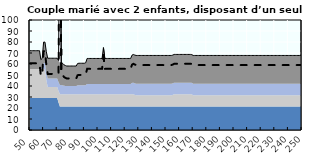
| Category | Coin fiscal marginal (somme des composantes) | Taux d’imposition marginal net |
|---|---|---|
| 50.0 | 72.098 | 60.645 |
| 51.0 | 72.098 | 60.645 |
| 52.0 | 72.098 | 60.645 |
| 53.0 | 72.098 | 60.645 |
| 54.0 | 72.098 | 60.645 |
| 55.0 | 72.098 | 60.645 |
| 56.0 | 72.098 | 60.645 |
| 57.0 | 72.098 | 60.645 |
| 58.0 | 63.937 | 49.135 |
| 59.0 | 65.15 | 50.845 |
| 60.0 | 79.927 | 71.687 |
| 61.0 | 79.927 | 71.687 |
| 62.0 | 71.124 | 59.271 |
| 63.0 | 65.244 | 50.978 |
| 64.0 | 65.244 | 50.978 |
| 65.0 | 65.244 | 50.978 |
| 66.0 | 65.244 | 50.978 |
| 67.0 | 65.244 | 50.978 |
| 68.0 | 65.244 | 50.978 |
| 69.0 | 65.244 | 50.978 |
| 70.0 | 65.244 | 50.978 |
| 71.0 | 63.136 | 50.978 |
| 72.0 | 229.432 | 264.441 |
| 73.0 | 61.414 | 50.978 |
| 74.0 | 60.575 | 49.912 |
| 75.0 | 59.243 | 48.22 |
| 76.0 | 58.619 | 47.426 |
| 77.0 | 58.158 | 46.84 |
| 78.0 | 58.158 | 46.84 |
| 79.0 | 58.158 | 46.84 |
| 80.0 | 58.158 | 46.84 |
| 81.0 | 58.158 | 46.84 |
| 82.0 | 58.158 | 46.84 |
| 83.0 | 58.158 | 46.84 |
| 84.0 | 58.158 | 46.84 |
| 85.0 | 60.482 | 49.794 |
| 86.0 | 60.691 | 50.059 |
| 87.0 | 60.691 | 50.059 |
| 88.0 | 60.691 | 50.059 |
| 89.0 | 60.691 | 50.059 |
| 90.0 | 60.691 | 50.059 |
| 91.0 | 61.2 | 50.706 |
| 92.0 | 65.033 | 55.575 |
| 93.0 | 65.033 | 55.575 |
| 94.0 | 65.033 | 55.575 |
| 95.0 | 65.033 | 55.575 |
| 96.0 | 65.033 | 55.575 |
| 97.0 | 65.033 | 55.575 |
| 98.0 | 65.033 | 55.575 |
| 99.0 | 65.033 | 55.575 |
| 100.0 | 65.033 | 55.575 |
| 101.0 | 65.033 | 55.575 |
| 102.0 | 65.033 | 55.575 |
| 103.0 | 65.033 | 55.575 |
| 104.0 | 74.905 | 68.118 |
| 105.0 | 65.033 | 55.575 |
| 106.0 | 65.033 | 55.575 |
| 107.0 | 65.033 | 55.575 |
| 108.0 | 65.033 | 55.575 |
| 109.0 | 65.033 | 55.575 |
| 110.0 | 65.033 | 55.575 |
| 111.0 | 65.033 | 55.575 |
| 112.0 | 65.033 | 55.575 |
| 113.0 | 65.033 | 55.575 |
| 114.0 | 65.033 | 55.575 |
| 115.0 | 65.033 | 55.575 |
| 116.0 | 65.033 | 55.575 |
| 117.0 | 65.033 | 55.575 |
| 118.0 | 65.033 | 55.575 |
| 119.0 | 65.033 | 55.575 |
| 120.0 | 65.033 | 55.575 |
| 121.0 | 65.033 | 55.575 |
| 122.0 | 65.033 | 55.575 |
| 123.0 | 65.033 | 55.575 |
| 124.0 | 65.033 | 55.575 |
| 125.0 | 68.026 | 59.378 |
| 126.0 | 68.651 | 60.172 |
| 127.0 | 68.159 | 59.547 |
| 128.0 | 67.762 | 59.042 |
| 129.0 | 67.762 | 59.042 |
| 130.0 | 67.762 | 59.042 |
| 131.0 | 67.762 | 59.042 |
| 132.0 | 67.762 | 59.042 |
| 133.0 | 67.762 | 59.042 |
| 134.0 | 67.762 | 59.042 |
| 135.0 | 67.762 | 59.042 |
| 136.0 | 67.762 | 59.042 |
| 137.0 | 67.762 | 59.042 |
| 138.0 | 67.762 | 59.042 |
| 139.0 | 67.762 | 59.042 |
| 140.0 | 67.762 | 59.042 |
| 141.0 | 67.762 | 59.042 |
| 142.0 | 67.762 | 59.042 |
| 143.0 | 67.762 | 59.042 |
| 144.0 | 67.762 | 59.042 |
| 145.0 | 67.762 | 59.042 |
| 146.0 | 67.762 | 59.042 |
| 147.0 | 67.762 | 59.042 |
| 148.0 | 67.762 | 59.042 |
| 149.0 | 67.762 | 59.042 |
| 150.0 | 67.762 | 59.042 |
| 151.0 | 67.762 | 59.042 |
| 152.0 | 67.762 | 59.042 |
| 153.0 | 67.762 | 59.042 |
| 154.0 | 67.762 | 59.042 |
| 155.0 | 68.104 | 59.477 |
| 156.0 | 68.695 | 60.227 |
| 157.0 | 68.695 | 60.227 |
| 158.0 | 68.695 | 60.227 |
| 159.0 | 68.695 | 60.227 |
| 160.0 | 68.695 | 60.227 |
| 161.0 | 68.695 | 60.227 |
| 162.0 | 68.695 | 60.227 |
| 163.0 | 68.695 | 60.227 |
| 164.0 | 68.695 | 60.227 |
| 165.0 | 68.695 | 60.227 |
| 166.0 | 68.695 | 60.227 |
| 167.0 | 68.695 | 60.227 |
| 168.0 | 68.695 | 60.227 |
| 169.0 | 68.516 | 60.001 |
| 170.0 | 67.762 | 59.042 |
| 171.0 | 67.762 | 59.042 |
| 172.0 | 67.762 | 59.042 |
| 173.0 | 67.762 | 59.042 |
| 174.0 | 67.762 | 59.042 |
| 175.0 | 67.762 | 59.042 |
| 176.0 | 67.762 | 59.042 |
| 177.0 | 67.762 | 59.042 |
| 178.0 | 67.762 | 59.042 |
| 179.0 | 67.762 | 59.042 |
| 180.0 | 67.762 | 59.042 |
| 181.0 | 67.762 | 59.042 |
| 182.0 | 67.762 | 59.042 |
| 183.0 | 67.762 | 59.042 |
| 184.0 | 67.762 | 59.042 |
| 185.0 | 67.762 | 59.042 |
| 186.0 | 67.762 | 59.042 |
| 187.0 | 67.762 | 59.042 |
| 188.0 | 67.762 | 59.042 |
| 189.0 | 67.762 | 59.042 |
| 190.0 | 67.762 | 59.042 |
| 191.0 | 67.762 | 59.042 |
| 192.0 | 67.762 | 59.042 |
| 193.0 | 67.762 | 59.042 |
| 194.0 | 67.762 | 59.042 |
| 195.0 | 67.762 | 59.042 |
| 196.0 | 67.762 | 59.042 |
| 197.0 | 67.762 | 59.042 |
| 198.0 | 67.762 | 59.042 |
| 199.0 | 67.762 | 59.042 |
| 200.0 | 67.762 | 59.042 |
| 201.0 | 67.762 | 59.042 |
| 202.0 | 67.762 | 59.042 |
| 203.0 | 67.762 | 59.042 |
| 204.0 | 67.762 | 59.042 |
| 205.0 | 67.762 | 59.042 |
| 206.0 | 67.762 | 59.042 |
| 207.0 | 67.762 | 59.042 |
| 208.0 | 67.762 | 59.042 |
| 209.0 | 67.762 | 59.042 |
| 210.0 | 67.762 | 59.042 |
| 211.0 | 67.762 | 59.042 |
| 212.0 | 67.762 | 59.042 |
| 213.0 | 67.762 | 59.042 |
| 214.0 | 67.762 | 59.042 |
| 215.0 | 67.762 | 59.042 |
| 216.0 | 67.762 | 59.042 |
| 217.0 | 67.762 | 59.042 |
| 218.0 | 67.762 | 59.042 |
| 219.0 | 67.762 | 59.042 |
| 220.0 | 67.762 | 59.042 |
| 221.0 | 67.762 | 59.042 |
| 222.0 | 67.762 | 59.042 |
| 223.0 | 67.762 | 59.042 |
| 224.0 | 67.762 | 59.042 |
| 225.0 | 67.762 | 59.042 |
| 226.0 | 67.762 | 59.042 |
| 227.0 | 67.762 | 59.042 |
| 228.0 | 67.762 | 59.042 |
| 229.0 | 67.762 | 59.042 |
| 230.0 | 67.762 | 59.042 |
| 231.0 | 67.762 | 59.042 |
| 232.0 | 67.762 | 59.042 |
| 233.0 | 67.762 | 59.042 |
| 234.0 | 67.762 | 59.042 |
| 235.0 | 67.762 | 59.042 |
| 236.0 | 67.762 | 59.042 |
| 237.0 | 67.762 | 59.042 |
| 238.0 | 67.762 | 59.042 |
| 239.0 | 67.762 | 59.042 |
| 240.0 | 67.762 | 59.042 |
| 241.0 | 67.762 | 59.042 |
| 242.0 | 67.762 | 59.042 |
| 243.0 | 67.762 | 59.042 |
| 244.0 | 67.762 | 59.042 |
| 245.0 | 67.762 | 59.042 |
| 246.0 | 67.762 | 59.042 |
| 247.0 | 67.762 | 59.042 |
| 248.0 | 67.762 | 59.042 |
| 249.0 | 67.762 | 59.042 |
| 250.0 | 67.762 | 59.042 |